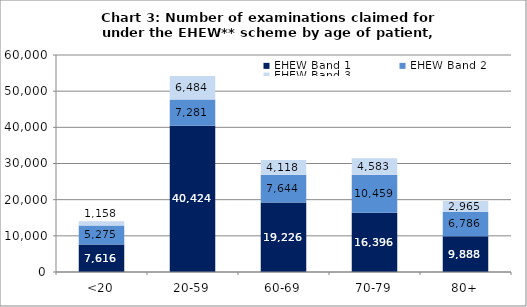
| Category | EHEW Band 1 | EHEW Band 2 | EHEW Band 3 |
|---|---|---|---|
| <20 | 7616 | 5275 | 1158 |
| 20-59 | 40424 | 7281 | 6484 |
| 60-69 | 19226 | 7644 | 4118 |
| 70-79 | 16396 | 10459 | 4583 |
| 80+ | 9888 | 6786 | 2965 |